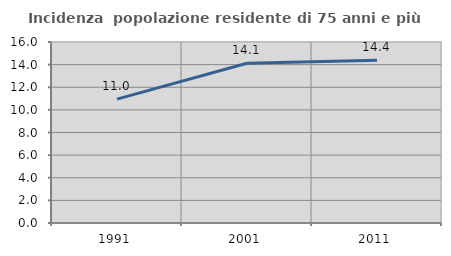
| Category | Incidenza  popolazione residente di 75 anni e più |
|---|---|
| 1991.0 | 10.953 |
| 2001.0 | 14.116 |
| 2011.0 | 14.385 |